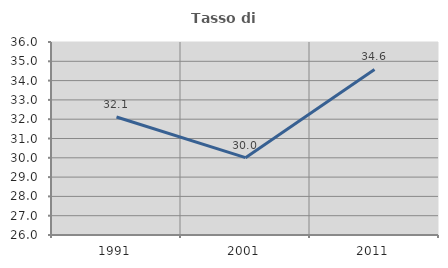
| Category | Tasso di occupazione   |
|---|---|
| 1991.0 | 32.114 |
| 2001.0 | 30.008 |
| 2011.0 | 34.578 |